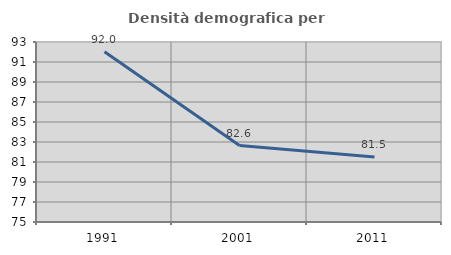
| Category | Densità demografica |
|---|---|
| 1991.0 | 92.035 |
| 2001.0 | 82.64 |
| 2011.0 | 81.489 |